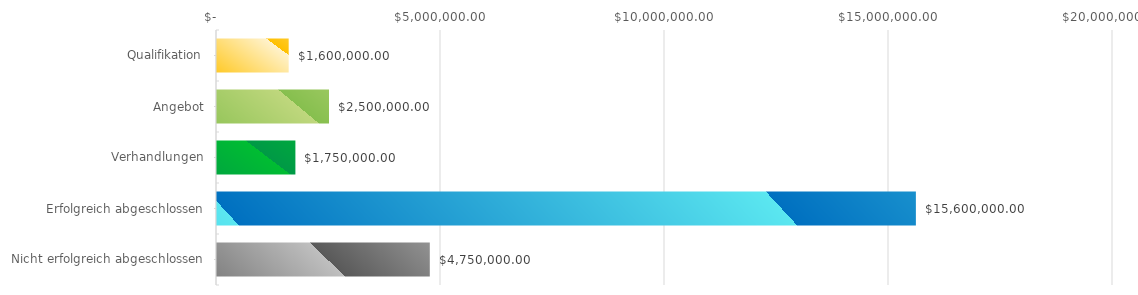
| Category | Series 0 |
|---|---|
| Qualifikation | 1600000 |
| Angebot | 2500000 |
| Verhandlungen | 1750000 |
| Erfolgreich abgeschlossen | 15600000 |
| Nicht erfolgreich abgeschlossen | 4750000 |